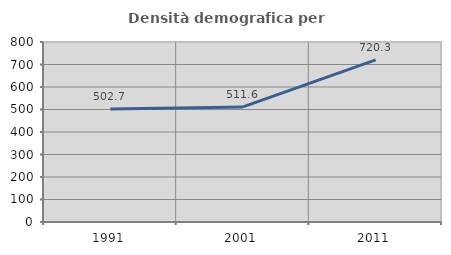
| Category | Densità demografica |
|---|---|
| 1991.0 | 502.729 |
| 2001.0 | 511.567 |
| 2011.0 | 720.302 |